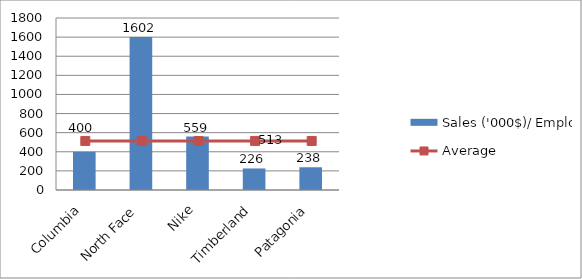
| Category | Sales ('000$)/ Employee |
|---|---|
| Columbia | 399.615 |
| North Face | 1602.136 |
| Nike | 559.067 |
| Timberland | 225.614 |
| Patagonia | 237.857 |